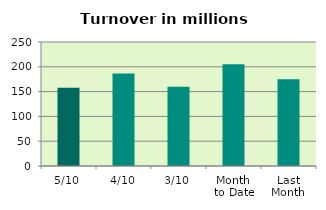
| Category | Series 0 |
|---|---|
| 5/10 | 157.847 |
| 4/10 | 186.696 |
| 3/10 | 159.876 |
| Month 
to Date | 205.04 |
| Last
Month | 174.723 |